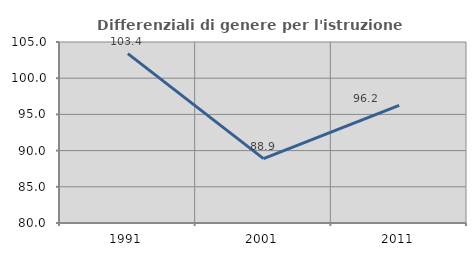
| Category | Differenziali di genere per l'istruzione superiore |
|---|---|
| 1991.0 | 103.401 |
| 2001.0 | 88.889 |
| 2011.0 | 96.234 |